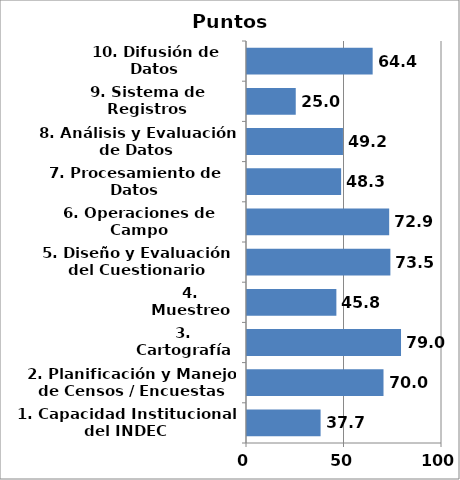
| Category | Series 0 |
|---|---|
| 1. Capacidad Institucional del INDEC | 37.736 |
| 2. Planificación y Manejo de Censos / Encuestas | 70 |
| 3. Cartografía | 78.986 |
| 4. Muestreo | 45.833 |
| 5. Diseño y Evaluación del Cuestionario | 73.529 |
| 6. Operaciones de Campo | 72.917 |
| 7. Procesamiento de Datos | 48.276 |
| 8. Análisis y Evaluación de Datos | 49.206 |
| 9. Sistema de Registros Administrativos | 25 |
| 10. Difusión de Datos | 64.444 |